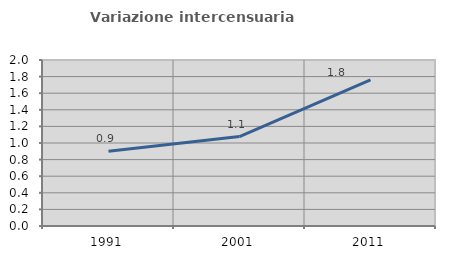
| Category | Variazione intercensuaria annua |
|---|---|
| 1991.0 | 0.901 |
| 2001.0 | 1.078 |
| 2011.0 | 1.761 |